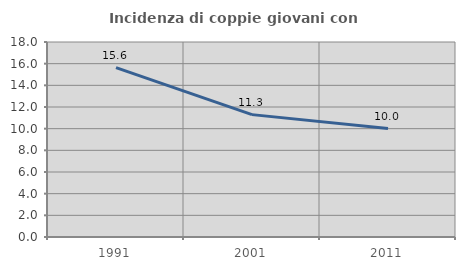
| Category | Incidenza di coppie giovani con figli |
|---|---|
| 1991.0 | 15.629 |
| 2001.0 | 11.296 |
| 2011.0 | 10.012 |